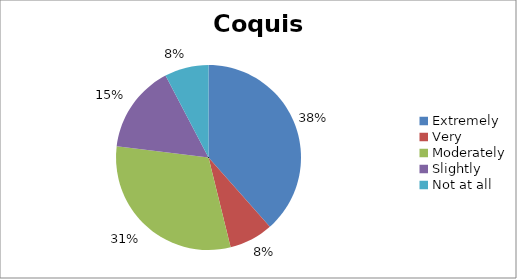
| Category | Coquis |
|---|---|
| Extremely | 5 |
| Very | 1 |
| Moderately | 4 |
| Slightly | 2 |
| Not at all | 1 |